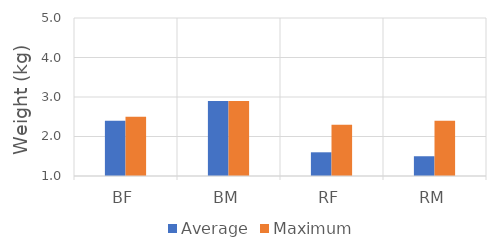
| Category | Average | Maximum |
|---|---|---|
| BF | 2.4 | 2.5 |
| BM | 2.9 | 2.9 |
| RF | 1.6 | 2.3 |
| RM | 1.5 | 2.4 |